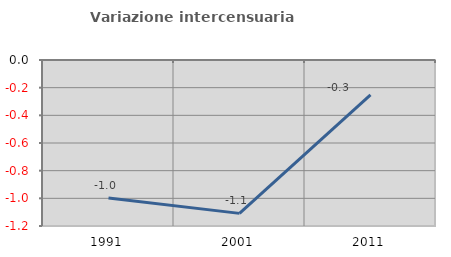
| Category | Variazione intercensuaria annua |
|---|---|
| 1991.0 | -0.998 |
| 2001.0 | -1.109 |
| 2011.0 | -0.252 |